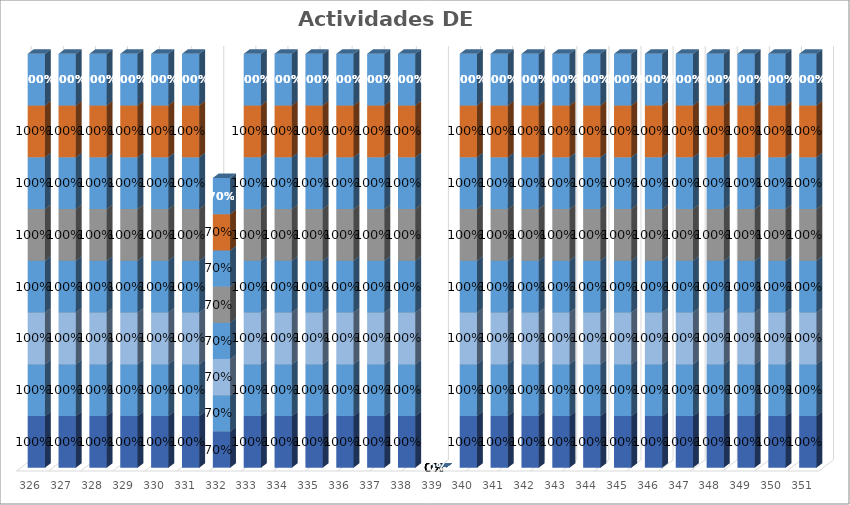
| Category | % Avance |
|---|---|
| 326.0 | 1 |
| 327.0 | 1 |
| 328.0 | 1 |
| 329.0 | 1 |
| 330.0 | 1 |
| 331.0 | 1 |
| 332.0 | 0.7 |
| 333.0 | 1 |
| 334.0 | 1 |
| 335.0 | 1 |
| 336.0 | 1 |
| 337.0 | 1 |
| 338.0 | 1 |
| 339.0 | 0 |
| 340.0 | 1 |
| 341.0 | 1 |
| 342.0 | 1 |
| 343.0 | 1 |
| 344.0 | 1 |
| 345.0 | 1 |
| 346.0 | 1 |
| 347.0 | 1 |
| 348.0 | 1 |
| 349.0 | 1 |
| 350.0 | 1 |
| 351.0 | 1 |